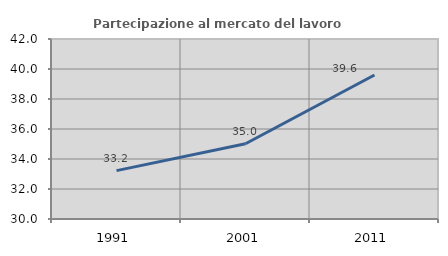
| Category | Partecipazione al mercato del lavoro  femminile |
|---|---|
| 1991.0 | 33.223 |
| 2001.0 | 35.02 |
| 2011.0 | 39.599 |